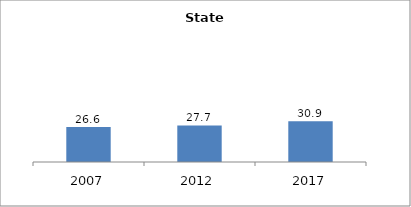
| Category | Series 0 |
|---|---|
| 2007.0 | 26.553 |
| 2012.0 | 27.728 |
| 2017.0 | 30.909 |